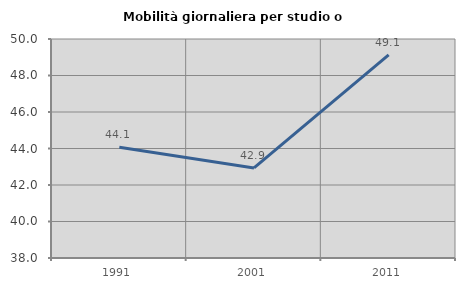
| Category | Mobilità giornaliera per studio o lavoro |
|---|---|
| 1991.0 | 44.065 |
| 2001.0 | 42.935 |
| 2011.0 | 49.125 |